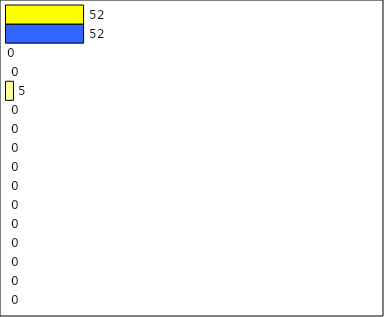
| Category | -2 | -1 | 0 | 1 | 2 | 3 | 4 | 5 | 6 | 7 | 8 | 9 | 10 | 11 | 12 | Perfect Round |
|---|---|---|---|---|---|---|---|---|---|---|---|---|---|---|---|---|
| 0 | 0 | 0 | 0 | 0 | 0 | 0 | 0 | 0 | 0 | 0 | 0 | 5 | 0 | 0 | 52 | 52 |